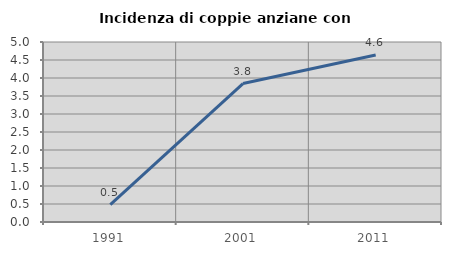
| Category | Incidenza di coppie anziane con figli |
|---|---|
| 1991.0 | 0.483 |
| 2001.0 | 3.846 |
| 2011.0 | 4.641 |